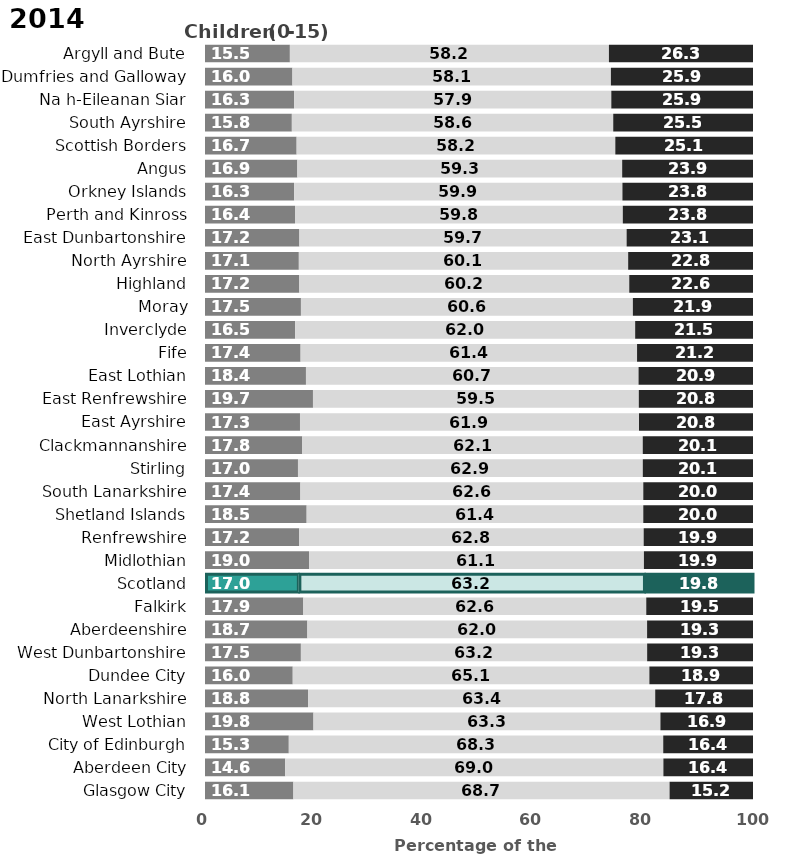
| Category | Children | Working age | Pensionable age |
|---|---|---|---|
| Argyll and Bute | 15.488 | 58.221 | 26.291 |
| Dumfries and Galloway | 15.956 | 58.111 | 25.933 |
| Na h-Eileanan Siar | 16.261 | 57.883 | 25.857 |
| South Ayrshire | 15.847 | 58.647 | 25.505 |
| Scottish Borders | 16.721 | 58.152 | 25.126 |
| Angus | 16.855 | 59.272 | 23.874 |
| Orkney Islands | 16.256 | 59.917 | 23.828 |
| Perth and Kinross | 16.425 | 59.816 | 23.759 |
| East Dunbartonshire | 17.228 | 59.711 | 23.061 |
| North Ayrshire | 17.123 | 60.097 | 22.781 |
| Highland | 17.216 | 60.202 | 22.582 |
| Moray | 17.507 | 60.572 | 21.921 |
| Inverclyde | 16.451 | 62.045 | 21.503 |
| Fife | 17.446 | 61.397 | 21.157 |
| East Lothian | 18.422 | 60.694 | 20.885 |
| East Renfrewshire | 19.701 | 59.46 | 20.839 |
| East Ayrshire | 17.333 | 61.864 | 20.802 |
| Clackmannanshire | 17.752 | 62.131 | 20.117 |
| Stirling | 16.966 | 62.923 | 20.111 |
| South Lanarkshire | 17.408 | 62.57 | 20.022 |
| Shetland Islands | 18.549 | 61.43 | 20.022 |
| Renfrewshire | 17.203 | 62.849 | 19.948 |
| Midlothian | 18.981 | 61.113 | 19.906 |
| Scotland | 17.036 | 63.157 | 19.807 |
| Falkirk | 17.939 | 62.582 | 19.479 |
| Aberdeenshire | 18.681 | 61.992 | 19.327 |
| West Dunbartonshire | 17.499 | 63.185 | 19.317 |
| Dundee City | 16.01 | 65.079 | 18.91 |
| North Lanarkshire | 18.803 | 63.351 | 17.846 |
| West Lothian | 19.793 | 63.312 | 16.895 |
| City of Edinburgh | 15.292 | 68.327 | 16.381 |
| Aberdeen City | 14.639 | 69.008 | 16.353 |
| Glasgow City | 16.128 | 68.65 | 15.222 |